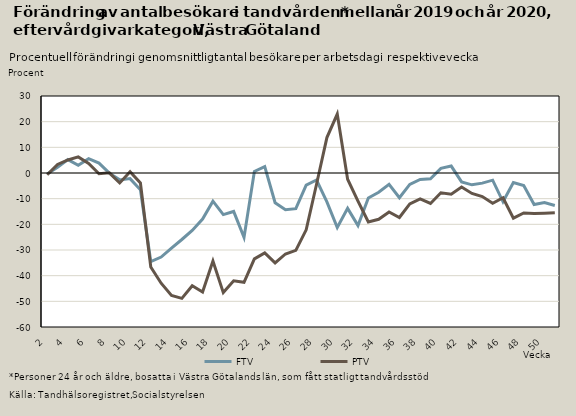
| Category | FTV | PTV |
|---|---|---|
| 2.0 | -0.359 | -0.693 |
| 3.0 | 2.252 | 3.35 |
| 4.0 | 5.233 | 5.083 |
| 5.0 | 2.984 | 6.262 |
| 6.0 | 5.604 | 3.757 |
| 7.0 | 3.876 | -0.309 |
| 8.0 | -0.058 | 0.07 |
| 9.0 | -2.679 | -3.883 |
| 10.0 | -2.187 | 0.473 |
| 11.0 | -6.547 | -3.895 |
| 12.0 | -34.509 | -36.608 |
| 13.0 | -32.738 | -42.948 |
| 14.0 | -29.273 | -47.711 |
| 15.0 | -25.908 | -48.837 |
| 16.0 | -22.365 | -43.945 |
| 17.0 | -17.931 | -46.359 |
| 18.0 | -10.973 | -34.262 |
| 19.0 | -16.215 | -46.598 |
| 20.0 | -14.98 | -41.978 |
| 21.0 | -25.101 | -42.601 |
| 22.0 | 0.608 | -33.468 |
| 23.0 | 2.496 | -31.137 |
| 24.0 | -11.567 | -35.027 |
| 25.0 | -14.28 | -31.553 |
| 26.0 | -13.895 | -30.14 |
| 27.0 | -4.733 | -22.136 |
| 28.0 | -2.734 | -4.372 |
| 29.0 | -11.262 | 13.809 |
| 30.0 | -21.248 | 22.968 |
| 31.0 | -13.784 | -2.428 |
| 32.0 | -20.44 | -10.967 |
| 33.0 | -9.729 | -19.066 |
| 34.0 | -7.514 | -18.032 |
| 35.0 | -4.402 | -15.175 |
| 36.0 | -9.63 | -17.336 |
| 37.0 | -4.434 | -12.032 |
| 38.0 | -2.492 | -10.047 |
| 39.0 | -2.22 | -11.855 |
| 40.0 | 1.823 | -7.709 |
| 41.0 | 2.704 | -8.294 |
| 42.0 | -3.464 | -5.472 |
| 43.0 | -4.605 | -7.972 |
| 44.0 | -3.953 | -9.174 |
| 45.0 | -2.796 | -11.77 |
| 46.0 | -11.218 | -9.623 |
| 47.0 | -3.731 | -17.6 |
| 48.0 | -4.886 | -15.589 |
| 49.0 | -12.308 | -15.744 |
| 50.0 | -11.533 | -15.639 |
| 51.0 | -12.643 | -15.451 |